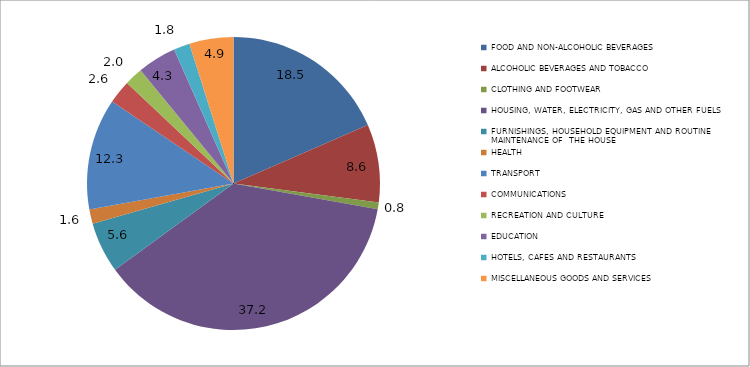
| Category | Series 0 |
|---|---|
| FOOD AND NON-ALCOHOLIC BEVERAGES  | 18.468 |
| ALCOHOLIC BEVERAGES AND TOBACCO | 8.589 |
| CLOTHING AND FOOTWEAR | 0.76 |
| HOUSING, WATER, ELECTRICITY, GAS AND OTHER FUELS | 37.175 |
| FURNISHINGS, HOUSEHOLD EQUIPMENT AND ROUTINE MAINTENANCE OF  THE HOUSE | 5.582 |
| HEALTH | 1.581 |
| TRANSPORT | 12.299 |
| COMMUNICATIONS | 2.596 |
| RECREATION AND CULTURE | 2.012 |
| EDUCATION | 4.295 |
| HOTELS, CAFES AND RESTAURANTS  | 1.779 |
| MISCELLANEOUS GOODS AND SERVICES | 4.864 |